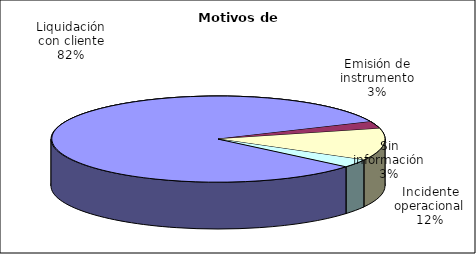
| Category | Motivos |
|---|---|
| Liquidación con cliente | 246 |
| Emisión de instrumento | 8 |
| Incidente operacional | 36 |
| Sin información | 9 |